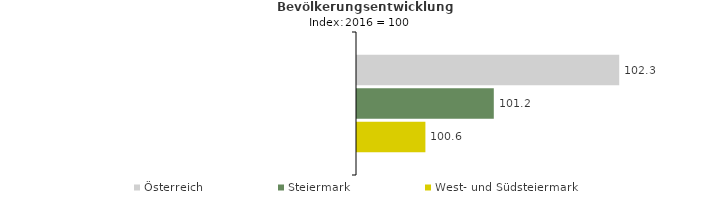
| Category | Österreich | Steiermark | West- und Südsteiermark |
|---|---|---|---|
| 2020.0 | 102.3 | 101.2 | 100.6 |